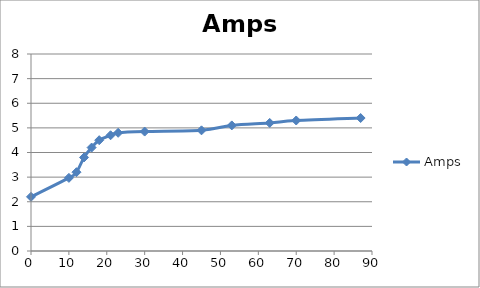
| Category | Amps |
|---|---|
| 0.0 | 2.2 |
| 10.0 | 2.97 |
| 12.0 | 3.2 |
| 14.0 | 3.8 |
| 16.0 | 4.2 |
| 18.0 | 4.5 |
| 21.0 | 4.7 |
| 23.0 | 4.8 |
| 30.0 | 4.85 |
| 45.0 | 4.9 |
| 53.0 | 5.1 |
| 63.0 | 5.2 |
| 70.0 | 5.3 |
| 87.0 | 5.4 |